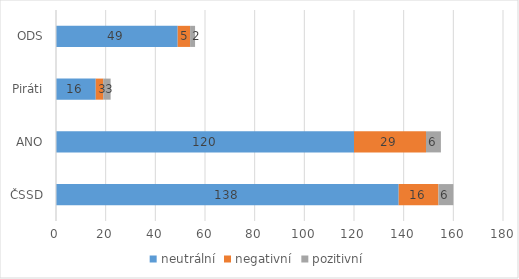
| Category | neutrální | negativní | pozitivní |
|---|---|---|---|
| ČSSD | 138 | 16 | 6 |
| ANO | 120 | 29 | 6 |
| Piráti | 16 | 3 | 3 |
| ODS | 49 | 5 | 2 |